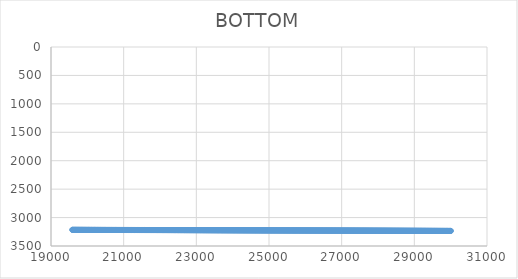
| Category | BOTTOM |
|---|---|
| 19585.5059 | 3215.52 |
| 19592.6397 | 3215.53 |
| 19602.8793 | 3215.55 |
| 19613.1194 | 3215.57 |
| 19623.3595 | 3215.59 |
| 19633.5996 | 3215.61 |
| 19643.8397 | 3215.63 |
| 19654.0798 | 3215.65 |
| 19664.3199 | 3215.66 |
| 19674.56 | 3215.68 |
| 19684.8001 | 3215.7 |
| 19695.0402 | 3215.72 |
| 19705.2803 | 3215.74 |
| 19715.5204 | 3215.76 |
| 19725.7605 | 3215.78 |
| 19736.0006 | 3215.79 |
| 19746.2407 | 3215.81 |
| 19756.4808 | 3215.83 |
| 19766.7209 | 3215.85 |
| 19776.961 | 3215.87 |
| 19787.2011 | 3215.89 |
| 19797.4413 | 3215.9 |
| 19807.6814 | 3215.92 |
| 19817.9215 | 3215.94 |
| 19828.1616 | 3215.96 |
| 19838.4017 | 3215.98 |
| 19848.6418 | 3216 |
| 19858.8819 | 3216.02 |
| 19869.122 | 3216.03 |
| 19879.3621 | 3216.05 |
| 19889.6022 | 3216.07 |
| 19899.8423 | 3216.09 |
| 19910.0824 | 3216.11 |
| 19920.3225 | 3216.13 |
| 19930.5626 | 3216.15 |
| 19940.8027 | 3216.16 |
| 19951.0428 | 3216.18 |
| 19961.2829 | 3216.2 |
| 19971.523 | 3216.22 |
| 19981.7631 | 3216.24 |
| 19992.0032 | 3216.26 |
| 20002.2433 | 3216.28 |
| 20012.4834 | 3216.29 |
| 20022.7235 | 3216.31 |
| 20032.9636 | 3216.33 |
| 20043.2037 | 3216.35 |
| 20053.4438 | 3216.37 |
| 20063.6839 | 3216.39 |
| 20073.9241 | 3216.41 |
| 20084.1642 | 3216.42 |
| 20094.4043 | 3216.44 |
| 20104.6444 | 3216.46 |
| 20114.8845 | 3216.48 |
| 20125.1246 | 3216.5 |
| 20135.3647 | 3216.52 |
| 20145.6048 | 3216.54 |
| 20155.8449 | 3216.55 |
| 20166.085 | 3216.57 |
| 20176.3251 | 3216.59 |
| 20186.5652 | 3216.61 |
| 20196.8053 | 3216.63 |
| 20207.0454 | 3216.65 |
| 20217.2855 | 3216.66 |
| 20227.5256 | 3216.68 |
| 20237.7657 | 3216.7 |
| 20248.0058 | 3216.72 |
| 20258.2459 | 3216.74 |
| 20268.486 | 3216.76 |
| 20278.7261 | 3216.78 |
| 20288.9662 | 3216.79 |
| 20299.2063 | 3216.81 |
| 20309.4464 | 3216.83 |
| 20319.6865 | 3216.85 |
| 20329.9266 | 3216.87 |
| 20340.1667 | 3216.89 |
| 20350.4069 | 3216.91 |
| 20360.647 | 3216.92 |
| 20370.8871 | 3216.94 |
| 20381.1272 | 3216.96 |
| 20391.3673 | 3216.98 |
| 20401.6074 | 3217 |
| 20411.8475 | 3217.02 |
| 20422.0876 | 3217.04 |
| 20432.3277 | 3217.05 |
| 20442.5678 | 3217.07 |
| 20452.8079 | 3217.09 |
| 20463.048 | 3217.11 |
| 20473.2881 | 3217.13 |
| 20483.5282 | 3217.15 |
| 20493.7683 | 3217.17 |
| 20504.0084 | 3217.18 |
| 20514.2485 | 3217.2 |
| 20524.4886 | 3217.22 |
| 20534.7287 | 3217.24 |
| 20544.9688 | 3217.26 |
| 20555.2089 | 3217.28 |
| 20565.449 | 3217.3 |
| 20575.6891 | 3217.31 |
| 20585.9292 | 3217.33 |
| 20596.1693 | 3217.35 |
| 20606.4094 | 3217.37 |
| 20616.6495 | 3217.39 |
| 20626.8897 | 3217.41 |
| 20637.1298 | 3217.42 |
| 20647.3699 | 3217.44 |
| 20657.61 | 3217.46 |
| 20667.8501 | 3217.48 |
| 20678.0902 | 3217.5 |
| 20688.3303 | 3217.52 |
| 20698.5704 | 3217.54 |
| 20708.8105 | 3217.55 |
| 20719.0506 | 3217.57 |
| 20729.2907 | 3217.59 |
| 20739.5308 | 3217.61 |
| 20749.7709 | 3217.63 |
| 20760.011 | 3217.65 |
| 20770.2511 | 3217.67 |
| 20780.4912 | 3217.68 |
| 20790.7313 | 3217.7 |
| 20800.9714 | 3217.72 |
| 20811.2115 | 3217.74 |
| 20821.4516 | 3217.76 |
| 20831.6917 | 3217.78 |
| 20841.9318 | 3217.8 |
| 20852.1719 | 3217.81 |
| 20862.412 | 3217.83 |
| 20872.6521 | 3217.85 |
| 20882.8922 | 3217.87 |
| 20893.1323 | 3217.89 |
| 20903.3724 | 3217.91 |
| 20913.6126 | 3217.93 |
| 20923.8527 | 3217.94 |
| 20934.0928 | 3217.96 |
| 20944.3329 | 3217.98 |
| 20954.573 | 3218 |
| 20964.8131 | 3218.02 |
| 20975.0532 | 3218.04 |
| 20985.2933 | 3218.06 |
| 20995.5334 | 3218.07 |
| 21005.7735 | 3218.09 |
| 21016.0136 | 3218.11 |
| 21026.2537 | 3218.13 |
| 21036.4938 | 3218.15 |
| 21046.7339 | 3218.17 |
| 21056.974 | 3218.18 |
| 21067.2141 | 3218.2 |
| 21077.4542 | 3218.22 |
| 21087.6943 | 3218.24 |
| 21097.9344 | 3218.26 |
| 21108.1745 | 3218.28 |
| 21118.4146 | 3218.3 |
| 21128.6547 | 3218.31 |
| 21138.8948 | 3218.33 |
| 21149.1349 | 3218.35 |
| 21159.375 | 3218.37 |
| 21169.6151 | 3218.39 |
| 21179.8552 | 3218.41 |
| 21190.0954 | 3218.43 |
| 21200.3355 | 3218.44 |
| 21210.5756 | 3218.46 |
| 21220.8157 | 3218.48 |
| 21231.0558 | 3218.5 |
| 21241.2959 | 3218.52 |
| 21251.536 | 3218.54 |
| 21261.7761 | 3218.56 |
| 21272.0162 | 3218.57 |
| 21282.2563 | 3218.59 |
| 21292.4964 | 3218.61 |
| 21302.7365 | 3218.63 |
| 21312.9766 | 3218.65 |
| 21323.2167 | 3218.67 |
| 21333.4568 | 3218.69 |
| 21343.6969 | 3218.7 |
| 21353.937 | 3218.72 |
| 21364.1771 | 3218.74 |
| 21374.4172 | 3218.76 |
| 21384.6573 | 3218.78 |
| 21394.8974 | 3218.8 |
| 21405.1375 | 3218.82 |
| 21415.3776 | 3218.83 |
| 21425.6177 | 3218.85 |
| 21435.8578 | 3218.87 |
| 21446.0979 | 3218.89 |
| 21456.338 | 3218.91 |
| 21466.5781 | 3218.93 |
| 21476.8183 | 3218.94 |
| 21487.0584 | 3218.96 |
| 21497.2985 | 3218.98 |
| 21507.5386 | 3219 |
| 21517.7787 | 3219.02 |
| 21528.0188 | 3219.04 |
| 21538.2589 | 3219.06 |
| 21548.499 | 3219.07 |
| 21558.7391 | 3219.09 |
| 21568.9792 | 3219.11 |
| 21579.2193 | 3219.13 |
| 21589.4594 | 3219.15 |
| 21599.6995 | 3219.17 |
| 21609.9396 | 3219.19 |
| 21620.1797 | 3219.2 |
| 21630.4198 | 3219.22 |
| 21640.6599 | 3219.24 |
| 21650.9 | 3219.26 |
| 21661.1401 | 3219.28 |
| 21671.3802 | 3219.3 |
| 21681.6203 | 3219.32 |
| 21691.8604 | 3219.33 |
| 21702.1005 | 3219.35 |
| 21712.3406 | 3219.37 |
| 21722.5807 | 3219.39 |
| 21732.8208 | 3219.41 |
| 21743.0609 | 3219.43 |
| 21753.301 | 3219.45 |
| 21763.5412 | 3219.46 |
| 21773.7813 | 3219.48 |
| 21784.0214 | 3219.5 |
| 21794.2615 | 3219.52 |
| 21804.5016 | 3219.54 |
| 21814.7417 | 3219.56 |
| 21824.9818 | 3219.58 |
| 21835.2219 | 3219.59 |
| 21845.462 | 3219.61 |
| 21855.7021 | 3219.63 |
| 21865.9422 | 3219.65 |
| 21876.1823 | 3219.67 |
| 21886.4224 | 3219.69 |
| 21896.6625 | 3219.7 |
| 21906.9026 | 3219.72 |
| 21917.1427 | 3219.74 |
| 21927.3828 | 3219.76 |
| 21937.6229 | 3219.78 |
| 21947.863 | 3219.8 |
| 21958.1031 | 3219.82 |
| 21968.3432 | 3219.83 |
| 21978.5833 | 3219.85 |
| 21988.8234 | 3219.87 |
| 21999.0635 | 3219.89 |
| 22009.3036 | 3219.91 |
| 22019.5437 | 3219.93 |
| 22029.7838 | 3219.95 |
| 22040.0239 | 3219.96 |
| 22050.2641 | 3219.98 |
| 22060.5042 | 3220 |
| 22070.7443 | 3220.02 |
| 22080.9844 | 3220.04 |
| 22091.2245 | 3220.06 |
| 22101.4646 | 3220.08 |
| 22111.7047 | 3220.09 |
| 22121.9448 | 3220.11 |
| 22132.1849 | 3220.13 |
| 22142.425 | 3220.15 |
| 22152.6651 | 3220.17 |
| 22162.9052 | 3220.19 |
| 22173.1453 | 3220.21 |
| 22183.3854 | 3220.22 |
| 22193.6255 | 3220.24 |
| 22203.8656 | 3220.26 |
| 22214.1057 | 3220.28 |
| 22224.3458 | 3220.3 |
| 22234.5859 | 3220.32 |
| 22244.826 | 3220.34 |
| 22255.0661 | 3220.35 |
| 22265.3062 | 3220.37 |
| 22275.5463 | 3220.39 |
| 22285.7864 | 3220.41 |
| 22296.0265 | 3220.43 |
| 22306.2666 | 3220.45 |
| 22316.5067 | 3220.46 |
| 22326.7468 | 3220.48 |
| 22336.987 | 3220.5 |
| 22347.2271 | 3220.52 |
| 22357.4672 | 3220.54 |
| 22367.7073 | 3220.56 |
| 22377.9474 | 3220.58 |
| 22388.1875 | 3220.59 |
| 22398.4276 | 3220.61 |
| 22408.6677 | 3220.63 |
| 22418.9078 | 3220.65 |
| 22429.1479 | 3220.67 |
| 22439.388 | 3220.69 |
| 22449.6281 | 3220.71 |
| 22459.8682 | 3220.72 |
| 22470.1083 | 3220.74 |
| 22480.3484 | 3220.76 |
| 22490.5885 | 3220.78 |
| 22500.8286 | 3220.8 |
| 22511.0687 | 3220.82 |
| 22521.3088 | 3220.84 |
| 22531.5489 | 3220.85 |
| 22541.789 | 3220.87 |
| 22552.0291 | 3220.89 |
| 22562.2692 | 3220.91 |
| 22572.5093 | 3220.93 |
| 22582.7494 | 3220.95 |
| 22592.9895 | 3220.97 |
| 22603.2296 | 3220.98 |
| 22613.4697 | 3221 |
| 22623.7099 | 3221.02 |
| 22633.95 | 3221.04 |
| 22644.1901 | 3221.06 |
| 22654.4302 | 3221.08 |
| 22664.6703 | 3221.1 |
| 22674.9104 | 3221.11 |
| 22685.1505 | 3221.13 |
| 22695.3906 | 3221.15 |
| 22705.6307 | 3221.17 |
| 22715.8708 | 3221.19 |
| 22726.1109 | 3221.21 |
| 22736.351 | 3221.22 |
| 22746.5911 | 3221.24 |
| 22756.8312 | 3221.26 |
| 22767.0713 | 3221.28 |
| 22777.3114 | 3221.3 |
| 22787.5515 | 3221.32 |
| 22797.7916 | 3221.34 |
| 22808.0317 | 3221.35 |
| 22818.2718 | 3221.37 |
| 22828.5119 | 3221.39 |
| 22838.752 | 3221.41 |
| 22848.9921 | 3221.43 |
| 22859.2322 | 3221.45 |
| 22869.4723 | 3221.47 |
| 22879.7124 | 3221.48 |
| 22889.9525 | 3221.5 |
| 22900.1926 | 3221.52 |
| 22910.4327 | 3221.54 |
| 22920.6729 | 3221.56 |
| 22930.913 | 3221.58 |
| 22941.1531 | 3221.6 |
| 22951.3932 | 3221.61 |
| 22961.6333 | 3221.63 |
| 22971.8734 | 3221.65 |
| 22982.1135 | 3221.67 |
| 22992.3536 | 3221.69 |
| 23002.5937 | 3221.71 |
| 23012.8338 | 3221.73 |
| 23023.0739 | 3221.74 |
| 23033.314 | 3221.76 |
| 23043.5541 | 3221.78 |
| 23053.7942 | 3221.8 |
| 23064.0343 | 3221.82 |
| 23074.2744 | 3221.84 |
| 23084.5145 | 3221.86 |
| 23094.7546 | 3221.87 |
| 23104.9947 | 3221.89 |
| 23115.2348 | 3221.91 |
| 23125.4749 | 3221.93 |
| 23135.715 | 3221.95 |
| 23145.9551 | 3221.97 |
| 23156.1952 | 3221.98 |
| 23166.4353 | 3222 |
| 23176.6754 | 3222.02 |
| 23186.9155 | 3222.04 |
| 23197.1556 | 3222.06 |
| 23207.3958 | 3222.08 |
| 23217.6359 | 3222.1 |
| 23227.876 | 3222.11 |
| 23238.1161 | 3222.13 |
| 23248.3562 | 3222.15 |
| 23258.5963 | 3222.17 |
| 23268.8364 | 3222.19 |
| 23279.0765 | 3222.21 |
| 23289.3166 | 3222.23 |
| 23299.5567 | 3222.24 |
| 23309.7968 | 3222.26 |
| 23320.0369 | 3222.28 |
| 23330.277 | 3222.3 |
| 23340.5171 | 3222.32 |
| 23350.7572 | 3222.34 |
| 23360.9973 | 3222.36 |
| 23371.2374 | 3222.37 |
| 23381.4775 | 3222.39 |
| 23391.7176 | 3222.41 |
| 23401.9577 | 3222.43 |
| 23412.1978 | 3222.45 |
| 23422.4379 | 3222.47 |
| 23432.678 | 3222.49 |
| 23442.9181 | 3222.5 |
| 23453.1582 | 3222.52 |
| 23463.3983 | 3222.54 |
| 23473.6384 | 3222.56 |
| 23483.8785 | 3222.58 |
| 23494.1186 | 3222.6 |
| 23504.3588 | 3222.62 |
| 23514.5989 | 3222.63 |
| 23524.839 | 3222.65 |
| 23535.0791 | 3222.67 |
| 23545.3192 | 3222.69 |
| 23555.5593 | 3222.71 |
| 23565.7994 | 3222.73 |
| 23576.0395 | 3222.74 |
| 23586.2796 | 3222.76 |
| 23596.5197 | 3222.78 |
| 23606.7598 | 3222.8 |
| 23616.9999 | 3222.82 |
| 23627.24 | 3222.84 |
| 23637.4801 | 3222.86 |
| 23647.7202 | 3222.87 |
| 23657.9603 | 3222.89 |
| 23668.2004 | 3222.91 |
| 23678.4405 | 3222.93 |
| 23688.6806 | 3222.95 |
| 23698.9207 | 3222.97 |
| 23709.1608 | 3222.99 |
| 23719.4009 | 3223 |
| 23729.641 | 3223.02 |
| 23739.8811 | 3223.04 |
| 23750.1212 | 3223.06 |
| 23760.3613 | 3223.08 |
| 23770.6014 | 3223.1 |
| 23780.8415 | 3223.12 |
| 23791.0816 | 3223.13 |
| 23801.3218 | 3223.15 |
| 23811.5619 | 3223.17 |
| 23821.802 | 3223.19 |
| 23832.0421 | 3223.21 |
| 23842.2822 | 3223.23 |
| 23852.5223 | 3223.25 |
| 23862.7624 | 3223.26 |
| 23873.0025 | 3223.28 |
| 23883.2426 | 3223.3 |
| 23893.4827 | 3223.32 |
| 23903.7228 | 3223.34 |
| 23913.9629 | 3223.36 |
| 23924.203 | 3223.38 |
| 23934.4431 | 3223.39 |
| 23944.6832 | 3223.41 |
| 23954.9233 | 3223.43 |
| 23965.1634 | 3223.45 |
| 23975.4035 | 3223.47 |
| 23985.6436 | 3223.49 |
| 23995.8837 | 3223.5 |
| 24006.1238 | 3223.52 |
| 24016.3639 | 3223.54 |
| 24026.604 | 3223.56 |
| 24036.8441 | 3223.58 |
| 24047.0842 | 3223.6 |
| 24057.3243 | 3223.62 |
| 24067.5644 | 3223.63 |
| 24077.8045 | 3223.65 |
| 24088.0446 | 3223.67 |
| 24098.2848 | 3223.69 |
| 24108.5249 | 3223.71 |
| 24118.765 | 3223.73 |
| 24129.0051 | 3223.75 |
| 24139.2452 | 3223.76 |
| 24149.4853 | 3223.78 |
| 24159.7254 | 3223.8 |
| 24169.9655 | 3223.82 |
| 24180.2056 | 3223.84 |
| 24190.4457 | 3223.86 |
| 24200.6858 | 3223.88 |
| 24210.9259 | 3223.89 |
| 24221.166 | 3223.91 |
| 24231.4061 | 3223.93 |
| 24241.6462 | 3223.95 |
| 24251.8863 | 3223.97 |
| 24262.1264 | 3223.99 |
| 24272.3665 | 3224.01 |
| 24282.6066 | 3224.02 |
| 24292.8467 | 3224.04 |
| 24303.0868 | 3224.06 |
| 24313.3269 | 3224.08 |
| 24323.567 | 3224.1 |
| 24333.8071 | 3224.12 |
| 24344.0472 | 3224.14 |
| 24354.2873 | 3224.15 |
| 24364.5274 | 3224.17 |
| 24374.7675 | 3224.19 |
| 24385.0076 | 3224.21 |
| 24395.2477 | 3224.23 |
| 24405.4879 | 3224.25 |
| 24415.728 | 3224.26 |
| 24425.9681 | 3224.28 |
| 24436.2082 | 3224.3 |
| 24446.4483 | 3224.32 |
| 24456.6884 | 3224.34 |
| 24466.9285 | 3224.36 |
| 24477.1686 | 3224.38 |
| 24487.4087 | 3224.39 |
| 24497.6488 | 3224.41 |
| 24507.8889 | 3224.43 |
| 24518.129 | 3224.45 |
| 24528.3691 | 3224.47 |
| 24538.6092 | 3224.49 |
| 24548.8493 | 3224.51 |
| 24559.0894 | 3224.52 |
| 24569.3295 | 3224.54 |
| 24579.5696 | 3224.56 |
| 24589.8097 | 3224.58 |
| 24600.0498 | 3224.6 |
| 24610.2899 | 3224.62 |
| 24620.53 | 3224.64 |
| 24630.7701 | 3224.65 |
| 24641.0102 | 3224.67 |
| 24651.2503 | 3224.69 |
| 24661.4904 | 3224.71 |
| 24671.7305 | 3224.73 |
| 24681.9706 | 3224.75 |
| 24692.2107 | 3224.77 |
| 24702.4509 | 3224.78 |
| 24712.691 | 3224.8 |
| 24722.9311 | 3224.82 |
| 24733.1712 | 3224.84 |
| 24743.4113 | 3224.86 |
| 24753.6514 | 3224.88 |
| 24763.8915 | 3224.9 |
| 24774.1316 | 3224.91 |
| 24784.3717 | 3224.93 |
| 24794.6118 | 3224.95 |
| 24804.8519 | 3224.97 |
| 24815.092 | 3224.99 |
| 24825.3321 | 3225.01 |
| 24835.5722 | 3225.02 |
| 24845.8123 | 3225.04 |
| 24856.0524 | 3225.06 |
| 24866.2925 | 3225.08 |
| 24876.5326 | 3225.1 |
| 24886.7727 | 3225.12 |
| 24897.0128 | 3225.14 |
| 24907.2529 | 3225.15 |
| 24917.493 | 3225.17 |
| 24927.7331 | 3225.19 |
| 24937.9732 | 3225.21 |
| 24948.2133 | 3225.23 |
| 24958.4534 | 3225.25 |
| 24968.6935 | 3225.27 |
| 24978.9336 | 3225.28 |
| 24989.1737 | 3225.3 |
| 24999.4138 | 3225.32 |
| 25009.654 | 3225.34 |
| 25019.8941 | 3225.36 |
| 25030.1342 | 3225.38 |
| 25040.3743 | 3225.4 |
| 25050.6144 | 3225.41 |
| 25060.8545 | 3225.43 |
| 25071.0946 | 3225.45 |
| 25081.3347 | 3225.47 |
| 25091.5748 | 3225.49 |
| 25101.8149 | 3225.51 |
| 25112.055 | 3225.53 |
| 25122.2951 | 3225.54 |
| 25132.5352 | 3225.56 |
| 25142.7753 | 3225.58 |
| 25153.0154 | 3225.6 |
| 25163.2555 | 3225.62 |
| 25173.4956 | 3225.64 |
| 25183.7357 | 3225.66 |
| 25193.9758 | 3225.67 |
| 25204.2159 | 3225.69 |
| 25214.456 | 3225.71 |
| 25224.6961 | 3225.73 |
| 25234.9362 | 3225.75 |
| 25245.1763 | 3225.77 |
| 25255.4164 | 3225.78 |
| 25265.6565 | 3225.8 |
| 25275.8966 | 3225.82 |
| 25286.1367 | 3225.84 |
| 25296.3768 | 3225.86 |
| 25306.6169 | 3225.88 |
| 25316.8571 | 3225.9 |
| 25327.0972 | 3225.91 |
| 25337.3373 | 3225.93 |
| 25347.5774 | 3225.95 |
| 25357.8175 | 3225.97 |
| 25368.0576 | 3225.99 |
| 25378.2977 | 3226.01 |
| 25388.5378 | 3226.03 |
| 25398.7779 | 3226.04 |
| 25409.018 | 3226.06 |
| 25419.2581 | 3226.08 |
| 25429.4982 | 3226.1 |
| 25439.7383 | 3226.12 |
| 25449.9784 | 3226.14 |
| 25460.2185 | 3226.16 |
| 25470.4586 | 3226.17 |
| 25480.6987 | 3226.19 |
| 25490.9388 | 3226.21 |
| 25501.1789 | 3226.23 |
| 25511.419 | 3226.25 |
| 25521.6591 | 3226.27 |
| 25531.8992 | 3226.29 |
| 25542.1393 | 3226.3 |
| 25552.3794 | 3226.32 |
| 25562.6195 | 3226.34 |
| 25572.8596 | 3226.36 |
| 25583.0997 | 3226.38 |
| 25593.3398 | 3226.4 |
| 25603.5799 | 3226.42 |
| 25613.82 | 3226.43 |
| 25624.0602 | 3226.45 |
| 25634.3003 | 3226.47 |
| 25644.5404 | 3226.49 |
| 25654.7805 | 3226.51 |
| 25665.0206 | 3226.53 |
| 25675.2607 | 3226.54 |
| 25685.5008 | 3226.56 |
| 25695.7409 | 3226.58 |
| 25705.981 | 3226.6 |
| 25716.2211 | 3226.62 |
| 25726.4612 | 3226.64 |
| 25736.7013 | 3226.66 |
| 25746.9414 | 3226.67 |
| 25757.1815 | 3226.69 |
| 25767.4216 | 3226.71 |
| 25777.6617 | 3226.73 |
| 25787.9018 | 3226.75 |
| 25798.1419 | 3226.77 |
| 25808.382 | 3226.79 |
| 25818.6221 | 3226.8 |
| 25828.8622 | 3226.82 |
| 25839.1023 | 3226.84 |
| 25849.3424 | 3226.86 |
| 25859.5825 | 3226.88 |
| 25869.8226 | 3226.9 |
| 25880.0627 | 3226.92 |
| 25890.3028 | 3226.93 |
| 25900.5429 | 3226.95 |
| 25910.783 | 3226.97 |
| 25921.0231 | 3226.99 |
| 25931.2633 | 3227.01 |
| 25941.5034 | 3227.03 |
| 25951.7435 | 3227.05 |
| 25961.9836 | 3227.06 |
| 25972.2237 | 3227.08 |
| 25982.4638 | 3227.1 |
| 25992.7039 | 3227.12 |
| 26002.944 | 3227.14 |
| 26013.1841 | 3227.16 |
| 26023.4242 | 3227.18 |
| 26033.6643 | 3227.19 |
| 26043.9044 | 3227.21 |
| 26054.1445 | 3227.23 |
| 26064.3846 | 3227.25 |
| 26074.6247 | 3227.27 |
| 26084.8648 | 3227.29 |
| 26095.1049 | 3227.3 |
| 26105.345 | 3227.32 |
| 26115.5851 | 3227.34 |
| 26125.8252 | 3227.36 |
| 26136.0653 | 3227.38 |
| 26146.3054 | 3227.4 |
| 26156.5455 | 3227.42 |
| 26166.7856 | 3227.43 |
| 26177.0257 | 3227.45 |
| 26187.2658 | 3227.47 |
| 26197.5059 | 3227.49 |
| 26207.746 | 3227.51 |
| 26217.9861 | 3227.53 |
| 26228.2262 | 3227.55 |
| 26238.4663 | 3227.56 |
| 26248.7065 | 3227.58 |
| 26258.9466 | 3227.6 |
| 26269.1867 | 3227.62 |
| 26279.4268 | 3227.64 |
| 26289.6669 | 3227.66 |
| 26299.907 | 3227.68 |
| 26310.1471 | 3227.69 |
| 26320.3872 | 3227.71 |
| 26330.6273 | 3227.73 |
| 26340.8674 | 3227.75 |
| 26351.1075 | 3227.77 |
| 26361.3476 | 3227.79 |
| 26371.5877 | 3227.81 |
| 26381.8278 | 3227.82 |
| 26392.0679 | 3227.84 |
| 26402.308 | 3227.86 |
| 26412.5481 | 3227.88 |
| 26422.7882 | 3227.9 |
| 26433.0283 | 3227.92 |
| 26443.2684 | 3227.94 |
| 26453.5085 | 3227.95 |
| 26463.7486 | 3227.97 |
| 26473.9887 | 3227.99 |
| 26484.2288 | 3228.01 |
| 26494.4689 | 3228.03 |
| 26504.709 | 3228.05 |
| 26514.9491 | 3228.06 |
| 26525.1892 | 3228.08 |
| 26535.4293 | 3228.1 |
| 26545.6694 | 3228.12 |
| 26555.9095 | 3228.14 |
| 26566.1497 | 3228.16 |
| 26576.3898 | 3228.18 |
| 26586.6299 | 3228.19 |
| 26596.87 | 3228.21 |
| 26607.1101 | 3228.23 |
| 26617.3502 | 3228.25 |
| 26627.5903 | 3228.27 |
| 26637.8304 | 3228.29 |
| 26648.0705 | 3228.31 |
| 26658.3106 | 3228.32 |
| 26668.5507 | 3228.34 |
| 26678.7908 | 3228.36 |
| 26689.0309 | 3228.38 |
| 26699.271 | 3228.4 |
| 26709.5111 | 3228.42 |
| 26719.7512 | 3228.44 |
| 26729.9913 | 3228.45 |
| 26740.2314 | 3228.47 |
| 26750.4715 | 3228.49 |
| 26760.7116 | 3228.51 |
| 26770.9517 | 3228.53 |
| 26781.1918 | 3228.55 |
| 26791.4319 | 3228.57 |
| 26801.672 | 3228.58 |
| 26811.9121 | 3228.6 |
| 26822.1522 | 3228.62 |
| 26832.3923 | 3228.64 |
| 26842.6324 | 3228.66 |
| 26852.8725 | 3228.68 |
| 26863.1126 | 3228.7 |
| 26873.3528 | 3228.71 |
| 26883.5929 | 3228.73 |
| 26893.833 | 3228.75 |
| 26904.0731 | 3228.77 |
| 26914.3132 | 3228.79 |
| 26924.5533 | 3228.81 |
| 26934.7934 | 3228.82 |
| 26945.0335 | 3228.84 |
| 26955.2736 | 3228.86 |
| 26965.5137 | 3228.88 |
| 26975.7538 | 3228.9 |
| 26985.9939 | 3228.92 |
| 26996.234 | 3228.94 |
| 27006.4741 | 3228.95 |
| 27016.7142 | 3228.97 |
| 27026.9543 | 3228.99 |
| 27037.1944 | 3229.01 |
| 27047.4345 | 3229.03 |
| 27057.6746 | 3229.05 |
| 27067.9147 | 3229.07 |
| 27078.1548 | 3229.08 |
| 27088.3949 | 3229.1 |
| 27098.635 | 3229.12 |
| 27108.8751 | 3229.14 |
| 27119.1152 | 3229.16 |
| 27129.3553 | 3229.18 |
| 27139.5954 | 3229.2 |
| 27149.8355 | 3229.21 |
| 27160.0756 | 3229.23 |
| 27170.3157 | 3229.25 |
| 27180.5558 | 3229.27 |
| 27190.7959 | 3229.29 |
| 27201.0361 | 3229.31 |
| 27211.2762 | 3229.33 |
| 27221.5163 | 3229.34 |
| 27231.7564 | 3229.36 |
| 27241.9965 | 3229.38 |
| 27252.2366 | 3229.4 |
| 27262.4767 | 3229.42 |
| 27272.7168 | 3229.44 |
| 27282.9569 | 3229.46 |
| 27293.197 | 3229.47 |
| 27303.4371 | 3229.49 |
| 27313.6772 | 3229.51 |
| 27323.9173 | 3229.53 |
| 27334.1574 | 3229.55 |
| 27344.3975 | 3229.57 |
| 27354.6376 | 3229.58 |
| 27364.8777 | 3229.6 |
| 27375.1178 | 3229.62 |
| 27385.3579 | 3229.64 |
| 27395.598 | 3229.66 |
| 27405.8381 | 3229.68 |
| 27416.0782 | 3229.7 |
| 27426.3183 | 3229.71 |
| 27436.5584 | 3229.73 |
| 27446.7985 | 3229.75 |
| 27457.0386 | 3229.77 |
| 27467.2787 | 3229.79 |
| 27477.5188 | 3229.81 |
| 27487.7589 | 3229.83 |
| 27497.999 | 3229.84 |
| 27508.2391 | 3229.86 |
| 27518.4793 | 3229.88 |
| 27528.7194 | 3229.9 |
| 27538.9595 | 3229.92 |
| 27549.1996 | 3229.94 |
| 27559.4397 | 3229.96 |
| 27569.6798 | 3229.97 |
| 27579.9199 | 3229.99 |
| 27590.16 | 3230.01 |
| 27600.4001 | 3230.03 |
| 27610.6402 | 3230.05 |
| 27620.8803 | 3230.07 |
| 27631.1204 | 3230.09 |
| 27641.3605 | 3230.1 |
| 27651.6006 | 3230.12 |
| 27661.8407 | 3230.14 |
| 27672.0808 | 3230.16 |
| 27682.3209 | 3230.18 |
| 27692.561 | 3230.2 |
| 27702.8011 | 3230.22 |
| 27713.0412 | 3230.23 |
| 27723.2813 | 3230.25 |
| 27733.5214 | 3230.27 |
| 27743.7615 | 3230.29 |
| 27754.0016 | 3230.31 |
| 27764.2417 | 3230.33 |
| 27774.4818 | 3230.34 |
| 27784.7219 | 3230.36 |
| 27794.962 | 3230.38 |
| 27805.2021 | 3230.4 |
| 27815.4422 | 3230.42 |
| 27825.6823 | 3230.44 |
| 27835.9224 | 3230.46 |
| 27846.1626 | 3230.47 |
| 27856.4027 | 3230.49 |
| 27866.6428 | 3230.51 |
| 27876.8829 | 3230.53 |
| 27887.123 | 3230.55 |
| 27897.3631 | 3230.57 |
| 27907.6032 | 3230.59 |
| 27917.8433 | 3230.6 |
| 27928.0834 | 3230.62 |
| 27938.3235 | 3230.64 |
| 27948.5636 | 3230.66 |
| 27958.8037 | 3230.68 |
| 27969.0438 | 3230.7 |
| 27979.2839 | 3230.72 |
| 27989.524 | 3230.73 |
| 27999.7641 | 3230.75 |
| 28010.0042 | 3230.77 |
| 28020.2443 | 3230.79 |
| 28030.4844 | 3230.81 |
| 28040.7245 | 3230.83 |
| 28050.9646 | 3230.85 |
| 28061.2047 | 3230.86 |
| 28071.4448 | 3230.88 |
| 28081.6849 | 3230.9 |
| 28091.925 | 3230.92 |
| 28102.1651 | 3230.94 |
| 28112.4052 | 3230.96 |
| 28122.6453 | 3230.98 |
| 28132.8854 | 3230.99 |
| 28143.1255 | 3231.01 |
| 28153.3656 | 3231.03 |
| 28163.6058 | 3231.05 |
| 28173.8459 | 3231.07 |
| 28184.086 | 3231.09 |
| 28194.3261 | 3231.1 |
| 28204.5662 | 3231.12 |
| 28214.8063 | 3231.14 |
| 28225.0464 | 3231.16 |
| 28235.2865 | 3231.18 |
| 28245.5266 | 3231.2 |
| 28255.7667 | 3231.22 |
| 28266.0068 | 3231.23 |
| 28276.2469 | 3231.25 |
| 28286.487 | 3231.27 |
| 28296.7271 | 3231.29 |
| 28306.9672 | 3231.31 |
| 28317.2073 | 3231.33 |
| 28327.4474 | 3231.35 |
| 28337.6875 | 3231.36 |
| 28347.9276 | 3231.38 |
| 28358.1677 | 3231.4 |
| 28368.4078 | 3231.42 |
| 28378.6479 | 3231.44 |
| 28388.888 | 3231.46 |
| 28399.1281 | 3231.48 |
| 28409.3682 | 3231.49 |
| 28419.6083 | 3231.51 |
| 28429.8484 | 3231.53 |
| 28440.0885 | 3231.55 |
| 28450.3286 | 3231.57 |
| 28460.5687 | 3231.59 |
| 28470.8088 | 3231.61 |
| 28481.0489 | 3231.62 |
| 28491.289 | 3231.64 |
| 28501.5292 | 3231.66 |
| 28511.7693 | 3231.68 |
| 28522.0094 | 3231.7 |
| 28532.2495 | 3231.72 |
| 28542.4896 | 3231.74 |
| 28552.7297 | 3231.75 |
| 28562.9698 | 3231.77 |
| 28573.2099 | 3231.79 |
| 28583.45 | 3231.81 |
| 28593.6901 | 3231.83 |
| 28603.9302 | 3231.85 |
| 28614.1703 | 3231.86 |
| 28624.4104 | 3231.88 |
| 28634.6505 | 3231.9 |
| 28644.8906 | 3231.92 |
| 28655.1307 | 3231.94 |
| 28665.3708 | 3231.96 |
| 28675.6109 | 3231.98 |
| 28685.851 | 3231.99 |
| 28696.0911 | 3232.01 |
| 28706.3312 | 3232.03 |
| 28716.5713 | 3232.05 |
| 28726.8114 | 3232.07 |
| 28737.0515 | 3232.09 |
| 28747.2916 | 3232.11 |
| 28757.5317 | 3232.12 |
| 28767.7718 | 3232.14 |
| 28778.0119 | 3232.16 |
| 28788.252 | 3232.18 |
| 28798.4921 | 3232.2 |
| 28808.7322 | 3232.22 |
| 28818.9723 | 3232.24 |
| 28829.2125 | 3232.25 |
| 28839.4526 | 3232.27 |
| 28849.6927 | 3232.29 |
| 28859.9328 | 3232.31 |
| 28870.1729 | 3232.33 |
| 28880.413 | 3232.35 |
| 28890.6531 | 3232.37 |
| 28900.8932 | 3232.38 |
| 28911.1333 | 3232.4 |
| 28921.3734 | 3232.42 |
| 28931.6135 | 3232.44 |
| 28941.8536 | 3232.46 |
| 28952.0937 | 3232.48 |
| 28962.3338 | 3232.5 |
| 28972.5739 | 3232.51 |
| 28982.814 | 3232.53 |
| 28993.0541 | 3232.55 |
| 29003.2942 | 3232.57 |
| 29013.5343 | 3232.59 |
| 29023.7744 | 3232.61 |
| 29034.0145 | 3232.62 |
| 29044.2546 | 3232.64 |
| 29054.4947 | 3232.66 |
| 29064.7348 | 3232.68 |
| 29074.9749 | 3232.7 |
| 29085.215 | 3232.72 |
| 29095.4551 | 3232.74 |
| 29105.6952 | 3232.75 |
| 29115.9353 | 3232.77 |
| 29126.1754 | 3232.79 |
| 29136.4155 | 3232.81 |
| 29146.6556 | 3232.83 |
| 29156.8957 | 3232.85 |
| 29167.1359 | 3232.87 |
| 29177.376 | 3232.88 |
| 29187.6161 | 3232.9 |
| 29197.8562 | 3232.92 |
| 29208.0963 | 3232.94 |
| 29218.3364 | 3232.96 |
| 29228.5765 | 3232.98 |
| 29238.8166 | 3233 |
| 29249.0567 | 3233.01 |
| 29259.2968 | 3233.03 |
| 29269.5369 | 3233.05 |
| 29279.777 | 3233.07 |
| 29290.0171 | 3233.09 |
| 29300.2572 | 3233.11 |
| 29310.4973 | 3233.13 |
| 29320.7374 | 3233.14 |
| 29330.9775 | 3233.16 |
| 29341.2176 | 3233.18 |
| 29351.4577 | 3233.2 |
| 29361.6978 | 3233.22 |
| 29371.9379 | 3233.24 |
| 29382.178 | 3233.26 |
| 29392.4181 | 3233.27 |
| 29402.6582 | 3233.29 |
| 29412.8983 | 3233.31 |
| 29423.1384 | 3233.33 |
| 29433.3785 | 3233.35 |
| 29443.6186 | 3233.37 |
| 29453.8587 | 3233.38 |
| 29464.0988 | 3233.4 |
| 29474.3389 | 3233.42 |
| 29484.579 | 3233.44 |
| 29494.8192 | 3233.46 |
| 29505.0593 | 3233.48 |
| 29515.2994 | 3233.5 |
| 29525.5395 | 3233.51 |
| 29535.7796 | 3233.53 |
| 29546.0197 | 3233.55 |
| 29556.2598 | 3233.57 |
| 29566.4999 | 3233.59 |
| 29576.74 | 3233.61 |
| 29586.9801 | 3233.63 |
| 29597.2202 | 3233.64 |
| 29607.4603 | 3233.66 |
| 29617.7004 | 3233.68 |
| 29627.9405 | 3233.7 |
| 29638.1806 | 3233.72 |
| 29648.4207 | 3233.74 |
| 29658.6608 | 3233.76 |
| 29668.9009 | 3233.77 |
| 29679.141 | 3233.79 |
| 29689.3811 | 3233.81 |
| 29699.6212 | 3233.83 |
| 29709.8613 | 3233.85 |
| 29720.1014 | 3233.87 |
| 29730.3415 | 3233.89 |
| 29740.5816 | 3233.9 |
| 29750.8217 | 3233.92 |
| 29761.0618 | 3233.94 |
| 29771.3019 | 3233.96 |
| 29781.542 | 3233.98 |
| 29791.7821 | 3234 |
| 29802.0222 | 3234.02 |
| 29812.2623 | 3234.03 |
| 29822.5024 | 3234.05 |
| 29832.7425 | 3234.07 |
| 29842.9827 | 3234.09 |
| 29853.2228 | 3234.11 |
| 29863.4629 | 3234.13 |
| 29873.703 | 3234.15 |
| 29883.9431 | 3234.16 |
| 29894.1832 | 3234.18 |
| 29904.4233 | 3234.2 |
| 29914.6634 | 3234.22 |
| 29924.9035 | 3234.24 |
| 29935.1436 | 3234.26 |
| 29945.3837 | 3234.27 |
| 29955.6238 | 3234.29 |
| 29965.8639 | 3234.31 |
| 29976.104 | 3234.33 |
| 29986.3441 | 3234.35 |
| 29996.5842 | 3234.37 |
| 30005.7545 | 3234.38 |